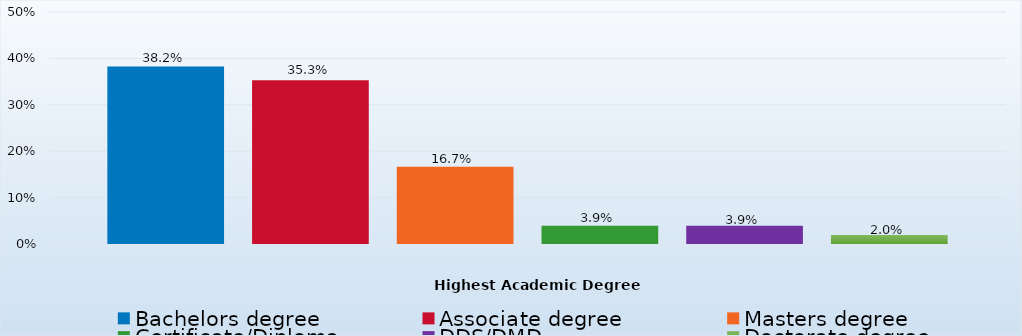
| Category | Bachelors degree | Associate degree | Masters degree | Certificate/Diploma | DDS/DMD | Doctorate degree |
|---|---|---|---|---|---|---|
| Percent | 0.382 | 0.353 | 0.167 | 0.039 | 0.039 | 0.02 |